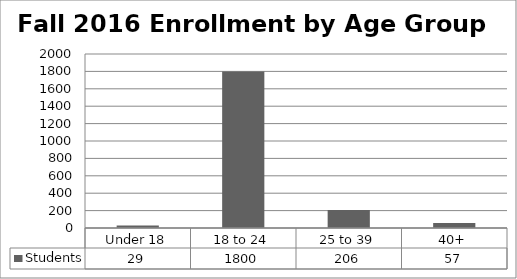
| Category | Students |
|---|---|
| Under 18 | 29 |
| 18 to 24 | 1800 |
| 25 to 39 | 206 |
| 40+ | 57 |